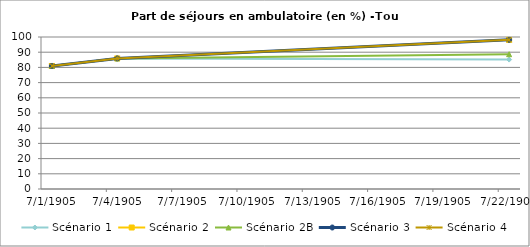
| Category | Scénario 1 | Scénario 2 | Scénario 2B | Scénario 3 | Scénario 4 |
|---|---|---|---|---|---|
| 2009.0 | 80.931 | 80.931 | 80.931 | 80.931 | 80.931 |
| 2012.0 | 85.913 | 85.913 | 85.913 | 85.913 | 85.913 |
| 2030.0 | 85.14 | 98.125 | 88.663 | 98.125 | 98.125 |